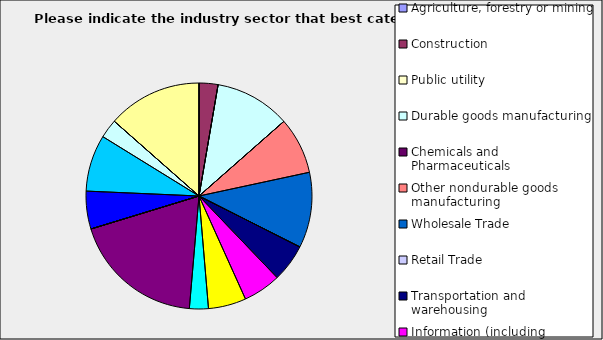
| Category | Series 0 |
|---|---|
| Agriculture, forestry or mining | 0 |
| Construction | 0.027 |
| Public utility | 0 |
| Durable goods manufacturing | 0.108 |
| Chemicals and Pharmaceuticals | 0 |
| Other nondurable goods manufacturing | 0.081 |
| Wholesale Trade | 0.108 |
| Retail Trade | 0 |
| Transportation and warehousing | 0.054 |
| Information (including broadcasting and telecommunication) | 0.054 |
| Finance and Insurance | 0.054 |
| Real Estate | 0.027 |
| Professional, scientific and technical services | 0.189 |
| Consulting | 0 |
| Administrative and office services (including waste management) | 0 |
| Education | 0.054 |
| Health Care and social services | 0.081 |
| Arts, entertainment and recreation | 0.027 |
| Accommodation and food services | 0 |
| Other | 0.135 |